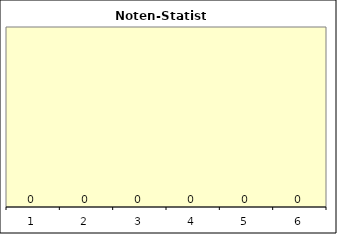
| Category | Series 0 | Series 1 |
|---|---|---|
| 0 |  | 0 |
| 1 |  | 0 |
| 2 |  | 0 |
| 3 |  | 0 |
| 4 |  | 0 |
| 5 |  | 0 |